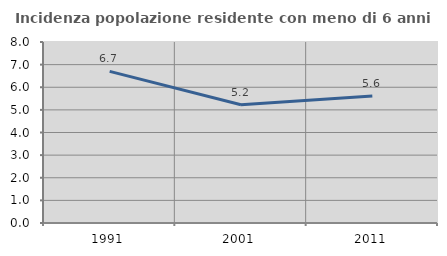
| Category | Incidenza popolazione residente con meno di 6 anni |
|---|---|
| 1991.0 | 6.703 |
| 2001.0 | 5.224 |
| 2011.0 | 5.613 |